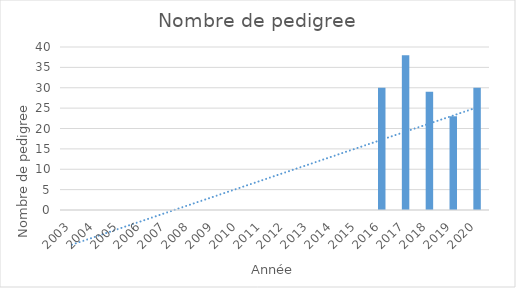
| Category | Series 0 |
|---|---|
| 2003.0 | 0 |
| 2004.0 | 0 |
| 2005.0 | 0 |
| 2006.0 | 0 |
| 2007.0 | 0 |
| 2008.0 | 0 |
| 2009.0 | 0 |
| 2010.0 | 0 |
| 2011.0 | 0 |
| 2012.0 | 0 |
| 2013.0 | 0 |
| 2014.0 | 0 |
| 2015.0 | 0 |
| 2016.0 | 30 |
| 2017.0 | 38 |
| 2018.0 | 29 |
| 2019.0 | 23 |
| 2020.0 | 30 |